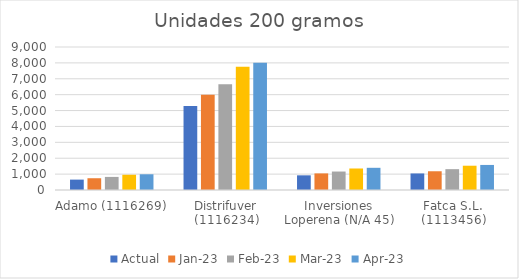
| Category | Actual | ene-23 | feb-23 | mar-23 | abr-23 |
|---|---|---|---|---|---|
| Adamo (1116269) | 654 | 740.328 | 823.245 | 959.08 | 989.771 |
| Distrifuver (1116234) | 5291 | 5989.412 | 6660.226 | 7759.163 | 8007.457 |
| Inversiones Loperena (N/A 45) | 923 | 1044.836 | 1161.858 | 1353.564 | 1396.878 |
| Fatca S.L. (1113456) | 1042 | 1179.544 | 1311.653 | 1528.076 | 1576.974 |